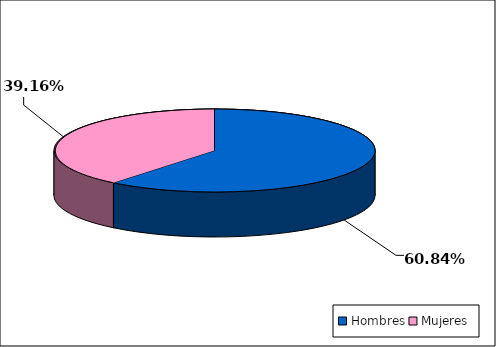
| Category | Series 0 |
|---|---|
| Hombres | 9057 |
| Mujeres | 5830 |